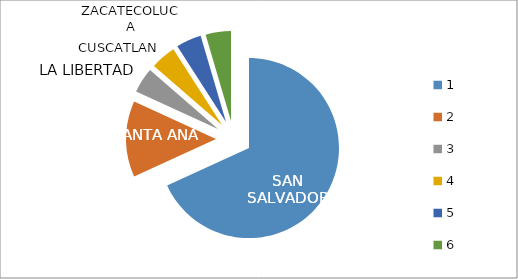
| Category | Series 0 |
|---|---|
| 0 | 15 |
| 1 | 3 |
| 2 | 1 |
| 3 | 1 |
| 4 | 1 |
| 5 | 1 |